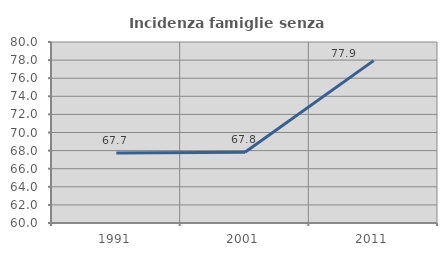
| Category | Incidenza famiglie senza nuclei |
|---|---|
| 1991.0 | 67.742 |
| 2001.0 | 67.816 |
| 2011.0 | 77.941 |